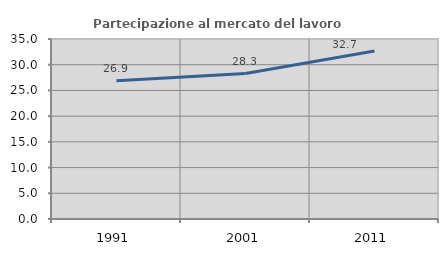
| Category | Partecipazione al mercato del lavoro  femminile |
|---|---|
| 1991.0 | 26.898 |
| 2001.0 | 28.284 |
| 2011.0 | 32.659 |